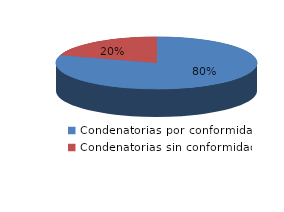
| Category | Series 0 |
|---|---|
| 0 | 384 |
| 1 | 97 |